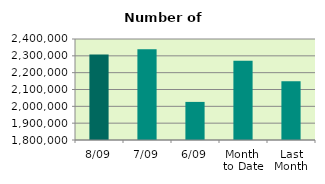
| Category | Series 0 |
|---|---|
| 8/09 | 2307446 |
| 7/09 | 2338608 |
| 6/09 | 2026318 |
| Month 
to Date | 2271142.667 |
| Last
Month | 2149140 |